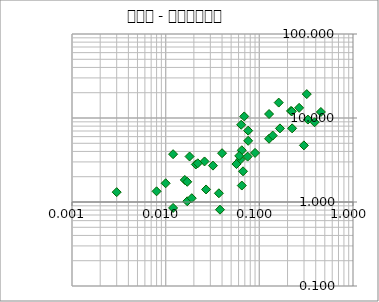
| Category | Series 0 |
|---|---|
| 0.321 | 19.25 |
| 0.224 | 7.53 |
| 0.127 | 5.66 |
| 0.063 | 3.21 |
| 0.021 | 2.8 |
| 0.027 | 1.41 |
| 0.139 | 6.18 |
| 0.218 | 12.15 |
| 0.008 | 1.34 |
| 0.012 | 3.71 |
| 0.076 | 5.35 |
| 0.299 | 4.72 |
| 0.04 | 3.81 |
| 0.069 | 10.44 |
| 0.33 | 9.58 |
| 0.017 | 1.02 |
| 0.166 | 7.52 |
| 0.003 | 1.31 |
| 0.01 | 1.67 |
| 0.076 | 7.07 |
| 0.454 | 11.79 |
| 0.032 | 2.71 |
| 0.266 | 13.21 |
| 0.018 | 3.48 |
| 0.038 | 0.81 |
| 0.067 | 2.32 |
| 0.075 | 3.47 |
| 0.064 | 8.31 |
| 0.065 | 1.57 |
| 0.065 | 4.13 |
| 0.09 | 3.84 |
| 0.016 | 1.83 |
| 0.061 | 3.54 |
| 0.019 | 1.11 |
| 0.389 | 8.9 |
| 0.037 | 1.27 |
| 0.161 | 15.26 |
| 0.127 | 11.15 |
| 0.017 | 1.74 |
| 0.222 | 11.98 |
| 0.026 | 3.04 |
| 0.012 | 0.85 |
| 0.057 | 2.83 |
| 0.022 | 2.89 |